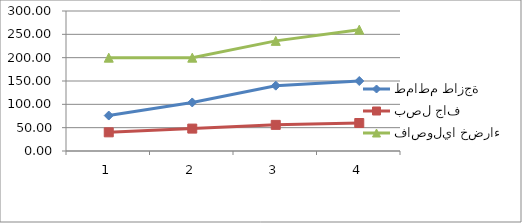
| Category | طماطم طازجة | بصل جاف | فاصوليا خضراء |
|---|---|---|---|
| 0 | 76 | 40 | 200 |
| 1 | 104 | 48 | 200 |
| 2 | 140 | 56 | 236 |
| 3 | 150 | 60 | 260 |